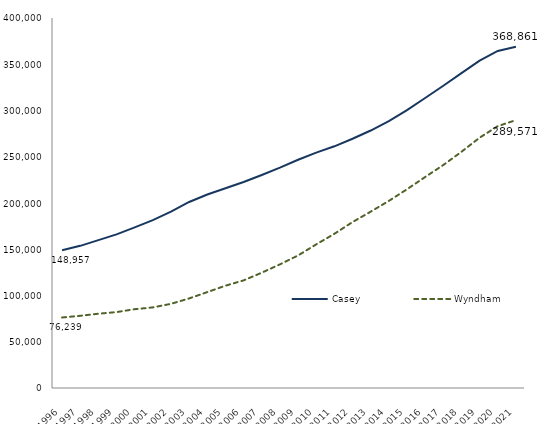
| Category | Casey  | Wyndham  |
|---|---|---|
| 1996.0 | 148957 | 76239 |
| 1997.0 | 153694 | 78061 |
| 1998.0 | 159855 | 80296 |
| 1999.0 | 166132 | 82069 |
| 2000.0 | 173642 | 85195 |
| 2001.0 | 181562 | 87141 |
| 2002.0 | 190758 | 90982 |
| 2003.0 | 201119 | 96830 |
| 2004.0 | 209202 | 103684 |
| 2005.0 | 215923 | 110598 |
| 2006.0 | 222681 | 116332 |
| 2007.0 | 230207 | 124663 |
| 2008.0 | 238176 | 133654 |
| 2009.0 | 246721 | 143313 |
| 2010.0 | 254471 | 155251 |
| 2011.0 | 261282 | 166699 |
| 2012.0 | 269447 | 179376 |
| 2013.0 | 278358 | 190642 |
| 2014.0 | 288553 | 202250 |
| 2015.0 | 300408 | 214872 |
| 2016.0 | 313521 | 228088 |
| 2017.0 | 326771 | 241071 |
| 2018.0 | 340443 | 255367 |
| 2019.0 | 353962 | 270607 |
| 2020.0 | 364394 | 283082 |
| 2021.0 | 368861 | 289571 |